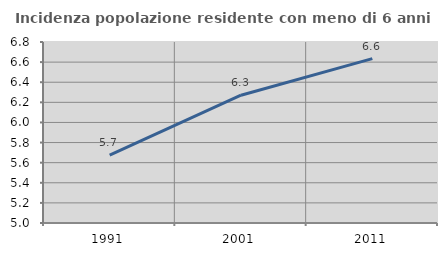
| Category | Incidenza popolazione residente con meno di 6 anni |
|---|---|
| 1991.0 | 5.674 |
| 2001.0 | 6.271 |
| 2011.0 | 6.634 |